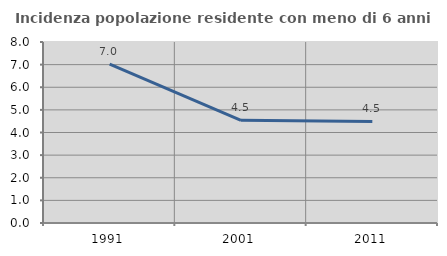
| Category | Incidenza popolazione residente con meno di 6 anni |
|---|---|
| 1991.0 | 7.02 |
| 2001.0 | 4.539 |
| 2011.0 | 4.49 |